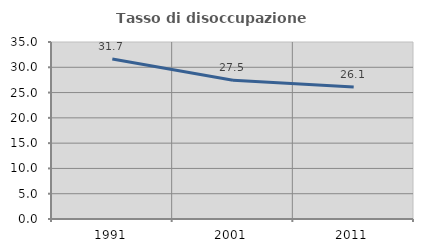
| Category | Tasso di disoccupazione giovanile  |
|---|---|
| 1991.0 | 31.653 |
| 2001.0 | 27.451 |
| 2011.0 | 26.115 |